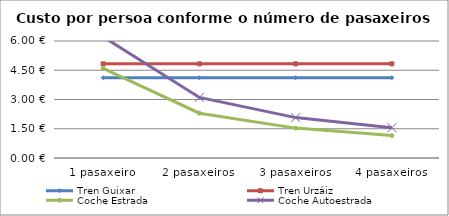
| Category | Tren Guixar | Tren Urzáiz | Coche Estrada | Coche Autoestrada |
|---|---|---|---|---|
| 1 pasaxeiro | 4.117 | 4.829 | 4.597 | 6.215 |
| 2 pasaxeiros | 4.117 | 4.829 | 2.298 | 3.107 |
| 3 pasaxeiros | 4.117 | 4.829 | 1.532 | 2.072 |
| 4 pasaxeiros | 4.117 | 4.829 | 1.149 | 1.554 |